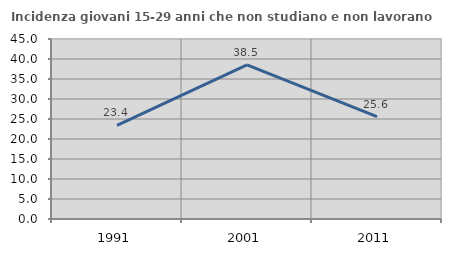
| Category | Incidenza giovani 15-29 anni che non studiano e non lavorano  |
|---|---|
| 1991.0 | 23.404 |
| 2001.0 | 38.524 |
| 2011.0 | 25.594 |